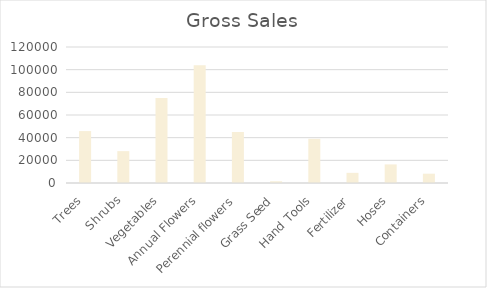
| Category | Gross Sales |
|---|---|
| Trees | 45800 |
| Shrubs | 28110 |
| Vegetables | 74965 |
| Annual Flowers | 103802 |
| Perennial flowers | 45022 |
| Grass Seed | 1539 |
| Hand Tools | 39012 |
| Fertilizer | 8944 |
| Hoses | 16389 |
| Containers | 8208 |